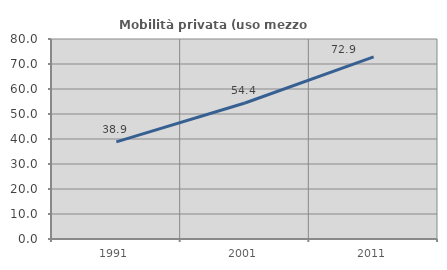
| Category | Mobilità privata (uso mezzo privato) |
|---|---|
| 1991.0 | 38.851 |
| 2001.0 | 54.393 |
| 2011.0 | 72.872 |